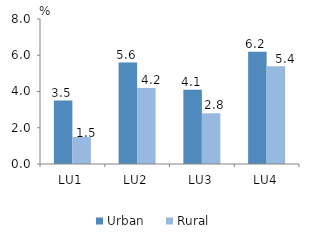
| Category | Urban | Rural |
|---|---|---|
| LU1 | 3.5 | 1.5 |
| LU2 | 5.6 | 4.2 |
| LU3 | 4.1 | 2.8 |
| LU4 | 6.2 | 5.4 |